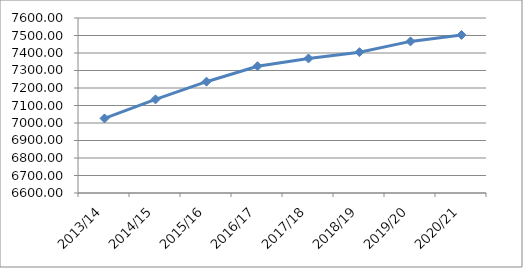
| Category | Series 0 |
|---|---|
| 2013/14 | 7026.07 |
| 2014/15 | 7134.86 |
| 2015/16 | 7236.01 |
| 2016/17 | 7324.34 |
| 2017/18 | 7368.7 |
| 2018/19 | 7404.8 |
| 2019/20 | 7466.25 |
| 2020/21 | 7503.223 |